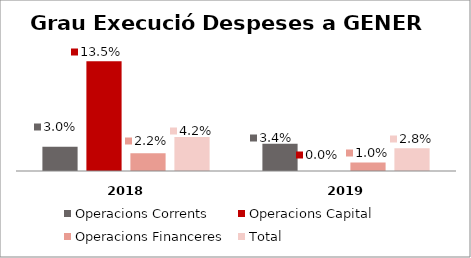
| Category | Operacions Corrents | Operacions Capital | Operacions Financeres | Total |
|---|---|---|---|---|
| 0 | 0.03 | 0.135 | 0.022 | 0.042 |
| 1 | 0.034 | 0 | 0.01 | 0.028 |